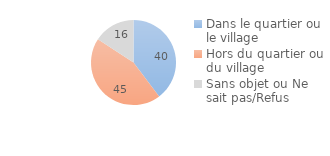
| Category | Series 0 |
|---|---|
| Dans le quartier ou le village | 39.696 |
| Hors du quartier ou du village | 44.522 |
| Sans objet ou Ne sait pas/Refus | 15.782 |